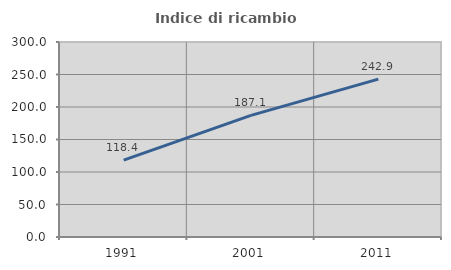
| Category | Indice di ricambio occupazionale  |
|---|---|
| 1991.0 | 118.367 |
| 2001.0 | 187.097 |
| 2011.0 | 242.857 |